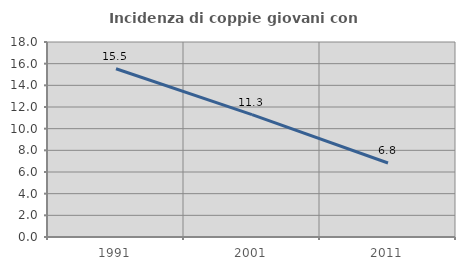
| Category | Incidenza di coppie giovani con figli |
|---|---|
| 1991.0 | 15.528 |
| 2001.0 | 11.296 |
| 2011.0 | 6.833 |